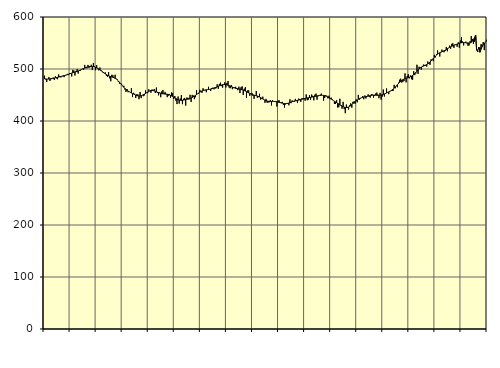
| Category | Piggar | Series 1 |
|---|---|---|
| nan | 487.1 | 480.89 |
| 87.0 | 480 | 480.9 |
| 87.0 | 475 | 480.64 |
| 87.0 | 480.7 | 480.66 |
| 87.0 | 484.4 | 480.72 |
| 87.0 | 477.1 | 480.86 |
| 87.0 | 482.4 | 481.09 |
| 87.0 | 481.3 | 481.42 |
| 87.0 | 483.7 | 481.87 |
| 87.0 | 479.2 | 482.41 |
| 87.0 | 485.9 | 482.98 |
| 87.0 | 481.9 | 483.54 |
| nan | 480.4 | 484.07 |
| 88.0 | 489.5 | 484.55 |
| 88.0 | 486.5 | 485.06 |
| 88.0 | 483.8 | 485.57 |
| 88.0 | 486.3 | 486.06 |
| 88.0 | 487.3 | 486.56 |
| 88.0 | 484.4 | 487.12 |
| 88.0 | 487.8 | 487.7 |
| 88.0 | 488.8 | 488.34 |
| 88.0 | 490.5 | 489.04 |
| 88.0 | 488.2 | 489.8 |
| 88.0 | 492.2 | 490.58 |
| nan | 492.3 | 491.36 |
| 89.0 | 485.7 | 492.11 |
| 89.0 | 498.3 | 492.78 |
| 89.0 | 497 | 493.4 |
| 89.0 | 487.5 | 494.02 |
| 89.0 | 496.4 | 494.66 |
| 89.0 | 499.6 | 495.37 |
| 89.0 | 491.3 | 496.19 |
| 89.0 | 497.8 | 497.07 |
| 89.0 | 496.6 | 498.05 |
| 89.0 | 499.3 | 499.07 |
| 89.0 | 500.6 | 500.1 |
| nan | 498.4 | 501.11 |
| 90.0 | 507.9 | 502.06 |
| 90.0 | 501.5 | 502.92 |
| 90.0 | 501.3 | 503.62 |
| 90.0 | 507.9 | 504.17 |
| 90.0 | 502 | 504.57 |
| 90.0 | 503.6 | 504.78 |
| 90.0 | 508.1 | 504.83 |
| 90.0 | 497.9 | 504.73 |
| 90.0 | 511.6 | 504.45 |
| 90.0 | 504.9 | 503.98 |
| 90.0 | 497.6 | 503.32 |
| nan | 507.4 | 502.43 |
| 91.0 | 500.3 | 501.33 |
| 91.0 | 497.3 | 500.06 |
| 91.0 | 502.9 | 498.67 |
| 91.0 | 496 | 497.13 |
| 91.0 | 495.4 | 495.51 |
| 91.0 | 492.2 | 493.83 |
| 91.0 | 492.5 | 492.15 |
| 91.0 | 493.3 | 490.55 |
| 91.0 | 487 | 489.11 |
| 91.0 | 485.1 | 487.88 |
| 91.0 | 494 | 486.89 |
| nan | 482 | 486.1 |
| 92.0 | 476.4 | 485.41 |
| 92.0 | 488.9 | 484.76 |
| 92.0 | 487.7 | 484.04 |
| 92.0 | 483.5 | 483.18 |
| 92.0 | 489 | 482.1 |
| 92.0 | 481.3 | 480.73 |
| 92.0 | 479.9 | 479.04 |
| 92.0 | 475.1 | 477.02 |
| 92.0 | 471.9 | 474.67 |
| 92.0 | 472.7 | 472.15 |
| 92.0 | 471.5 | 469.56 |
| nan | 466.9 | 467.03 |
| 93.0 | 467.8 | 464.72 |
| 93.0 | 460.5 | 462.66 |
| 93.0 | 455.8 | 460.8 |
| 93.0 | 461.4 | 459.16 |
| 93.0 | 455.4 | 457.68 |
| 93.0 | 456.2 | 456.31 |
| 93.0 | 455 | 455.06 |
| 93.0 | 463 | 453.91 |
| 93.0 | 446 | 452.85 |
| 93.0 | 454.2 | 451.81 |
| 93.0 | 452.4 | 450.79 |
| nan | 444.3 | 449.83 |
| 94.0 | 451.4 | 449.01 |
| 94.0 | 451.2 | 448.4 |
| 94.0 | 441.9 | 448.13 |
| 94.0 | 455.8 | 448.24 |
| 94.0 | 444.1 | 448.7 |
| 94.0 | 449.5 | 449.48 |
| 94.0 | 447.7 | 450.54 |
| 94.0 | 449.2 | 451.74 |
| 94.0 | 458.9 | 453.04 |
| 94.0 | 453.8 | 454.41 |
| 94.0 | 453.6 | 455.74 |
| nan | 461 | 456.96 |
| 95.0 | 458.2 | 457.96 |
| 95.0 | 454.4 | 458.59 |
| 95.0 | 460.6 | 458.79 |
| 95.0 | 458.6 | 458.56 |
| 95.0 | 461.5 | 457.96 |
| 95.0 | 453.9 | 457.17 |
| 95.0 | 464.3 | 456.31 |
| 95.0 | 453.7 | 455.45 |
| 95.0 | 449.3 | 454.66 |
| 95.0 | 454.9 | 453.93 |
| 95.0 | 445.8 | 453.28 |
| nan | 457 | 452.74 |
| 96.0 | 459.7 | 452.31 |
| 96.0 | 453.4 | 452.02 |
| 96.0 | 456 | 451.87 |
| 96.0 | 450.7 | 451.71 |
| 96.0 | 445.9 | 451.47 |
| 96.0 | 448.6 | 451.04 |
| 96.0 | 452 | 450.32 |
| 96.0 | 444.8 | 449.33 |
| 96.0 | 455.1 | 448.17 |
| 96.0 | 453.6 | 446.9 |
| 96.0 | 442.6 | 445.62 |
| nan | 448.1 | 444.38 |
| 97.0 | 439 | 443.18 |
| 97.0 | 432.6 | 442.04 |
| 97.0 | 447.1 | 441.04 |
| 97.0 | 433.5 | 440.3 |
| 97.0 | 443 | 439.87 |
| 97.0 | 449.8 | 439.74 |
| 97.0 | 432.4 | 439.87 |
| 97.0 | 442.7 | 440.21 |
| 97.0 | 444.4 | 440.67 |
| 97.0 | 429.7 | 441.13 |
| 97.0 | 444.9 | 441.62 |
| nan | 444.6 | 442.16 |
| 98.0 | 441.3 | 442.76 |
| 98.0 | 450.4 | 443.52 |
| 98.0 | 436.6 | 444.43 |
| 98.0 | 450.2 | 445.45 |
| 98.0 | 449.1 | 446.63 |
| 98.0 | 442 | 447.93 |
| 98.0 | 445.7 | 449.36 |
| 98.0 | 459.1 | 450.88 |
| 98.0 | 452.2 | 452.42 |
| 98.0 | 452.7 | 453.96 |
| 98.0 | 460 | 455.43 |
| nan | 457.9 | 456.71 |
| 99.0 | 454.2 | 457.77 |
| 99.0 | 462.9 | 458.61 |
| 99.0 | 458.7 | 459.25 |
| 99.0 | 459.1 | 459.73 |
| 99.0 | 455.4 | 460.07 |
| 99.0 | 460.7 | 460.36 |
| 99.0 | 465.8 | 460.64 |
| 99.0 | 460.8 | 460.95 |
| 99.0 | 457.8 | 461.36 |
| 99.0 | 463.5 | 461.9 |
| 99.0 | 464.1 | 462.55 |
| nan | 461 | 463.29 |
| 0.0 | 462.2 | 464.13 |
| 0.0 | 463 | 464.98 |
| 0.0 | 470.5 | 465.84 |
| 0.0 | 462 | 466.74 |
| 0.0 | 471.3 | 467.64 |
| 0.0 | 473.7 | 468.5 |
| 0.0 | 467.1 | 469.22 |
| 0.0 | 464.2 | 469.75 |
| 0.0 | 469.7 | 470.06 |
| 0.0 | 474.4 | 470.1 |
| 0.0 | 464.5 | 469.89 |
| nan | 473.4 | 469.44 |
| 1.0 | 476.9 | 468.83 |
| 1.0 | 464.3 | 468.07 |
| 1.0 | 463 | 467.16 |
| 1.0 | 469.3 | 466.2 |
| 1.0 | 461.2 | 465.25 |
| 1.0 | 463.3 | 464.32 |
| 1.0 | 464.3 | 463.53 |
| 1.0 | 465.8 | 462.94 |
| 1.0 | 461.8 | 462.49 |
| 1.0 | 459.3 | 462.12 |
| 1.0 | 466 | 461.76 |
| nan | 453.8 | 461.34 |
| 2.0 | 465 | 460.79 |
| 2.0 | 466.7 | 460.14 |
| 2.0 | 450.1 | 459.42 |
| 2.0 | 462.2 | 458.54 |
| 2.0 | 465.4 | 457.52 |
| 2.0 | 444.3 | 456.41 |
| 2.0 | 458.6 | 455.22 |
| 2.0 | 459 | 454.02 |
| 2.0 | 448.4 | 452.89 |
| 2.0 | 452.7 | 451.89 |
| 2.0 | 454.1 | 451.03 |
| nan | 448.1 | 450.33 |
| 3.0 | 442.7 | 449.74 |
| 3.0 | 449 | 449.19 |
| 3.0 | 457.6 | 448.64 |
| 3.0 | 445 | 448.04 |
| 3.0 | 445.7 | 447.26 |
| 3.0 | 452.3 | 446.29 |
| 3.0 | 441.1 | 445.14 |
| 3.0 | 443.1 | 443.8 |
| 3.0 | 446.8 | 442.39 |
| 3.0 | 440.9 | 441.04 |
| 3.0 | 435 | 439.88 |
| nan | 442.5 | 438.98 |
| 4.0 | 435.2 | 438.36 |
| 4.0 | 435.6 | 437.99 |
| 4.0 | 436.1 | 437.79 |
| 4.0 | 440.3 | 437.67 |
| 4.0 | 429.9 | 437.64 |
| 4.0 | 440.1 | 437.63 |
| 4.0 | 437.9 | 437.58 |
| 4.0 | 438 | 437.47 |
| 4.0 | 438.3 | 437.25 |
| 4.0 | 427.8 | 436.91 |
| 4.0 | 439.3 | 436.46 |
| nan | 439.9 | 435.93 |
| 5.0 | 434.6 | 435.33 |
| 5.0 | 436 | 434.75 |
| 5.0 | 436.8 | 434.23 |
| 5.0 | 430.9 | 433.8 |
| 5.0 | 425.9 | 433.51 |
| 5.0 | 431.9 | 433.45 |
| 5.0 | 433.1 | 433.61 |
| 5.0 | 432.9 | 434.01 |
| 5.0 | 430.2 | 434.63 |
| 5.0 | 441.7 | 435.42 |
| 5.0 | 434.3 | 436.29 |
| nan | 439.6 | 437.09 |
| 6.0 | 438.4 | 437.81 |
| 6.0 | 436.9 | 438.4 |
| 6.0 | 442.5 | 438.89 |
| 6.0 | 438.2 | 439.33 |
| 6.0 | 434.5 | 439.76 |
| 6.0 | 442.9 | 440.22 |
| 6.0 | 442.4 | 440.7 |
| 6.0 | 436.9 | 441.21 |
| 6.0 | 443.7 | 441.77 |
| 6.0 | 444 | 442.34 |
| 6.0 | 444.1 | 442.86 |
| nan | 438.9 | 443.36 |
| 7.0 | 451.2 | 443.85 |
| 7.0 | 439.8 | 444.31 |
| 7.0 | 441.2 | 444.74 |
| 7.0 | 449.8 | 445.12 |
| 7.0 | 440.5 | 445.5 |
| 7.0 | 450.9 | 445.88 |
| 7.0 | 448.4 | 446.29 |
| 7.0 | 439.8 | 446.75 |
| 7.0 | 450.6 | 447.24 |
| 7.0 | 452.7 | 447.74 |
| 7.0 | 441.1 | 448.21 |
| nan | 447.6 | 448.63 |
| 8.0 | 448.9 | 448.98 |
| 8.0 | 450.8 | 449.22 |
| 8.0 | 452.7 | 449.34 |
| 8.0 | 449.4 | 449.34 |
| 8.0 | 439.3 | 449.16 |
| 8.0 | 444.4 | 448.77 |
| 8.0 | 449.4 | 448.14 |
| 8.0 | 448.4 | 447.32 |
| 8.0 | 443.5 | 446.27 |
| 8.0 | 448.6 | 445.01 |
| 8.0 | 442 | 443.63 |
| nan | 444.9 | 442.21 |
| 9.0 | 441.5 | 440.76 |
| 9.0 | 439.5 | 439.37 |
| 9.0 | 432.7 | 438.03 |
| 9.0 | 432.9 | 436.7 |
| 9.0 | 439.9 | 435.4 |
| 9.0 | 425.8 | 434.12 |
| 9.0 | 426.7 | 432.79 |
| 9.0 | 442.7 | 431.45 |
| 9.0 | 429.1 | 430.1 |
| 9.0 | 423.8 | 428.79 |
| 9.0 | 436.8 | 427.61 |
| nan | 422.8 | 426.66 |
| 10.0 | 415 | 426.05 |
| 10.0 | 431.6 | 425.85 |
| 10.0 | 427 | 426.13 |
| 10.0 | 422.1 | 426.9 |
| 10.0 | 430.3 | 428.11 |
| 10.0 | 433.8 | 429.67 |
| 10.0 | 425.6 | 431.5 |
| 10.0 | 436.8 | 433.45 |
| 10.0 | 437.6 | 435.39 |
| 10.0 | 432.9 | 437.28 |
| 10.0 | 441.4 | 439.02 |
| nan | 435.9 | 440.55 |
| 11.0 | 450.2 | 441.92 |
| 11.0 | 441.1 | 443.09 |
| 11.0 | 443.4 | 444.01 |
| 11.0 | 445 | 444.78 |
| 11.0 | 447.9 | 445.45 |
| 11.0 | 441.9 | 446.01 |
| 11.0 | 449.1 | 446.49 |
| 11.0 | 443.3 | 446.93 |
| 11.0 | 447.2 | 447.37 |
| 11.0 | 451.2 | 447.83 |
| 11.0 | 446.7 | 448.36 |
| nan | 445.2 | 448.91 |
| 12.0 | 451.7 | 449.37 |
| 12.0 | 451 | 449.67 |
| 12.0 | 445.1 | 449.84 |
| 12.0 | 448.2 | 449.84 |
| 12.0 | 452.9 | 449.69 |
| 12.0 | 454.6 | 449.51 |
| 12.0 | 450.7 | 449.39 |
| 12.0 | 443.8 | 449.38 |
| 12.0 | 454.1 | 449.56 |
| 12.0 | 441.1 | 449.94 |
| 12.0 | 447.1 | 450.48 |
| nan | 460.5 | 451.17 |
| 13.0 | 447.1 | 451.99 |
| 13.0 | 452.1 | 452.92 |
| 13.0 | 462.5 | 453.94 |
| 13.0 | 454.6 | 454.98 |
| 13.0 | 451.6 | 455.98 |
| 13.0 | 457.8 | 457 |
| 13.0 | 458.2 | 458.15 |
| 13.0 | 457.7 | 459.55 |
| 13.0 | 457.7 | 461.22 |
| 13.0 | 469.5 | 463.15 |
| 13.0 | 462.9 | 465.33 |
| nan | 467 | 467.6 |
| 14.0 | 464.9 | 469.86 |
| 14.0 | 473.8 | 472.07 |
| 14.0 | 479.4 | 474.16 |
| 14.0 | 481.4 | 476.11 |
| 14.0 | 473.9 | 477.87 |
| 14.0 | 475.7 | 479.39 |
| 14.0 | 476.6 | 480.65 |
| 14.0 | 491.6 | 481.6 |
| 14.0 | 474.3 | 482.33 |
| 14.0 | 486.3 | 482.92 |
| 14.0 | 490.1 | 483.48 |
| nan | 481.9 | 484.18 |
| 15.0 | 487.5 | 485.11 |
| 15.0 | 480.3 | 486.31 |
| 15.0 | 479.4 | 487.74 |
| 15.0 | 495.7 | 489.43 |
| 15.0 | 488.2 | 491.4 |
| 15.0 | 491.2 | 493.59 |
| 15.0 | 508.2 | 495.86 |
| 15.0 | 490.7 | 498.09 |
| 15.0 | 504.4 | 500.12 |
| 15.0 | 502.5 | 501.9 |
| 15.0 | 498.5 | 503.38 |
| nan | 505.9 | 504.56 |
| 16.0 | 508.5 | 505.58 |
| 16.0 | 507.9 | 506.54 |
| 16.0 | 506.3 | 507.54 |
| 16.0 | 504.7 | 508.65 |
| 16.0 | 514.4 | 509.97 |
| 16.0 | 510.4 | 511.58 |
| 16.0 | 508.1 | 513.44 |
| 16.0 | 518.6 | 515.49 |
| 16.0 | 517.8 | 517.76 |
| 16.0 | 515 | 520.13 |
| 16.0 | 527.3 | 522.48 |
| nan | 522.4 | 524.73 |
| 17.0 | 528.1 | 526.76 |
| 17.0 | 535.7 | 528.5 |
| 17.0 | 530.1 | 529.98 |
| 17.0 | 524 | 531.22 |
| 17.0 | 532.8 | 532.24 |
| 17.0 | 537.3 | 533.16 |
| 17.0 | 533.5 | 534.1 |
| 17.0 | 532.3 | 535.14 |
| 17.0 | 534.6 | 536.32 |
| 17.0 | 542.4 | 537.64 |
| 17.0 | 534 | 539.06 |
| nan | 540 | 540.47 |
| 18.0 | 545 | 541.73 |
| 18.0 | 538.9 | 542.78 |
| 18.0 | 548.4 | 543.68 |
| 18.0 | 549.6 | 544.53 |
| 18.0 | 540.6 | 545.36 |
| 18.0 | 547 | 546.18 |
| 18.0 | 546.7 | 547.02 |
| 18.0 | 542.7 | 547.94 |
| 18.0 | 551.2 | 548.86 |
| 18.0 | 540.9 | 549.64 |
| 18.0 | 554.8 | 550.19 |
| nan | 561.3 | 550.56 |
| 19.0 | 553 | 550.76 |
| 19.0 | 545.4 | 550.83 |
| 19.0 | 551 | 550.75 |
| 19.0 | 552.6 | 550.51 |
| 19.0 | 549.4 | 550.22 |
| 19.0 | 544.6 | 549.99 |
| 19.0 | 545.4 | 549.94 |
| 19.0 | 553.8 | 550.3 |
| 19.0 | 563.3 | 551.34 |
| 19.0 | 557.8 | 553.31 |
| 19.0 | 548 | 556.35 |
| nan | 552.3 | 560.39 |
| 20.0 | 556 | 565.37 |
| 20.0 | 538.2 | 535.97 |
| 20.0 | 532.6 | 535.39 |
| 20.0 | 539.1 | 541.78 |
| 20.0 | 541.2 | 532.21 |
| 20.0 | 547.7 | 537.87 |
| 20.0 | 546.8 | 542.78 |
| 20.0 | 551.8 | 546.72 |
| 20.0 | 536.3 | 549.64 |
| 20.0 | 552.3 | 551.68 |
| 20.0 | 556.1 | 553.14 |